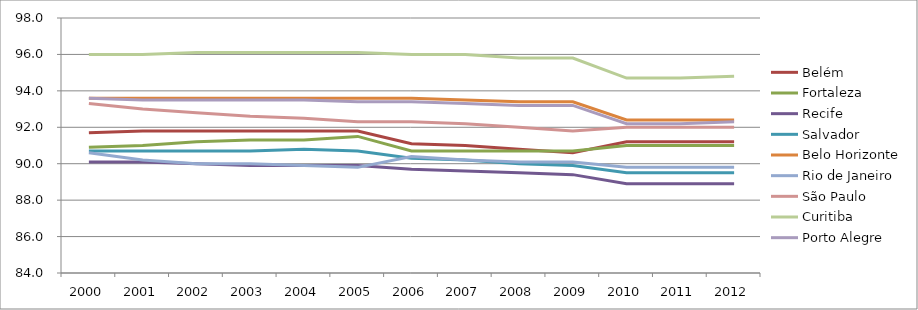
| Category | Belém | Fortaleza | Recife | Salvador | Belo Horizonte | Rio de Janeiro | São Paulo | Curitiba | Porto Alegre |
|---|---|---|---|---|---|---|---|---|---|
| 2000.0 | 91.7 | 90.9 | 90.1 | 90.7 | 93.6 | 90.6 | 93.3 | 96 | 93.6 |
| 2001.0 | 91.8 | 91 | 90.1 | 90.7 | 93.6 | 90.2 | 93 | 96 | 93.5 |
| 2002.0 | 91.8 | 91.2 | 90 | 90.7 | 93.6 | 90 | 92.8 | 96.1 | 93.5 |
| 2003.0 | 91.8 | 91.3 | 89.9 | 90.7 | 93.6 | 90 | 92.6 | 96.1 | 93.5 |
| 2004.0 | 91.8 | 91.3 | 89.9 | 90.8 | 93.6 | 89.9 | 92.5 | 96.1 | 93.5 |
| 2005.0 | 91.8 | 91.5 | 89.9 | 90.7 | 93.6 | 89.8 | 92.3 | 96.1 | 93.4 |
| 2006.0 | 91.1 | 90.7 | 89.7 | 90.3 | 93.6 | 90.4 | 92.3 | 96 | 93.4 |
| 2007.0 | 91 | 90.7 | 89.6 | 90.2 | 93.5 | 90.2 | 92.2 | 96 | 93.3 |
| 2008.0 | 90.8 | 90.7 | 89.5 | 90 | 93.4 | 90.1 | 92 | 95.8 | 93.2 |
| 2009.0 | 90.6 | 90.7 | 89.4 | 89.9 | 93.4 | 90.1 | 91.8 | 95.8 | 93.2 |
| 2010.0 | 91.2 | 91 | 88.9 | 89.5 | 92.4 | 89.8 | 92 | 94.7 | 92.2 |
| 2011.0 | 91.2 | 91 | 88.9 | 89.5 | 92.4 | 89.8 | 92 | 94.7 | 92.2 |
| 2012.0 | 91.2 | 91 | 88.9 | 89.5 | 92.4 | 89.8 | 92 | 94.8 | 92.3 |